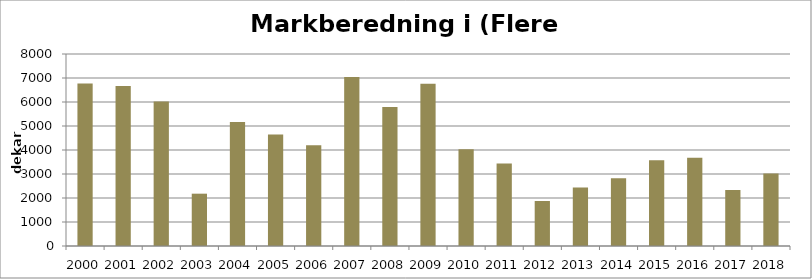
| Category | Totalt |
|---|---|
| 2000 | 6776 |
| 2001 | 6671 |
| 2002 | 6024 |
| 2003 | 2180 |
| 2004 | 5163 |
| 2005 | 4646 |
| 2006 | 4201 |
| 2007 | 7039 |
| 2008 | 5792 |
| 2009 | 6757 |
| 2010 | 4030 |
| 2011 | 3436 |
| 2012 | 1874 |
| 2013 | 2439 |
| 2014 | 2824 |
| 2015 | 3570 |
| 2016 | 3678 |
| 2017 | 2334 |
| 2018 | 3026 |